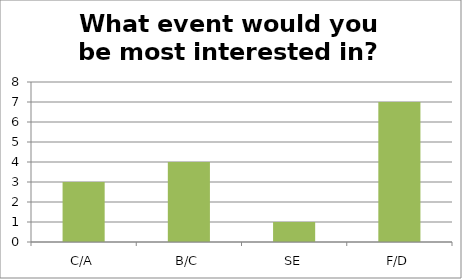
| Category | Series 0 |
|---|---|
| C/A | 3 |
| B/C | 4 |
| SE | 1 |
| F/D | 7 |